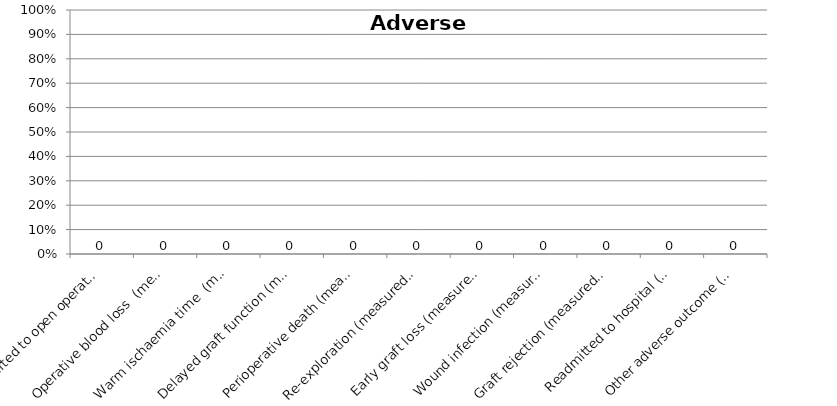
| Category | Series 0 |
|---|---|
| Converted to open operation (measured at procedure) | 0 |
| Operative blood loss  (measured at procedure) | 0 |
| Warm ischaemia time  (measured at procedure) | 0 |
| Delayed graft function (measured at 1 week) | 0 |
| Perioperative death (measured at 1 months) | 0 |
| Re-exploration (measured at 1 months) | 0 |
| Early graft loss (measured at 1 months) | 0 |
| Wound infection (measured at 3 months) | 0 |
| Graft rejection (measured at 12 months) | 0 |
| Readmitted to hospital (measured at 12 months) | 0 |
| Other adverse outcome (measured at 12 months) | 0 |